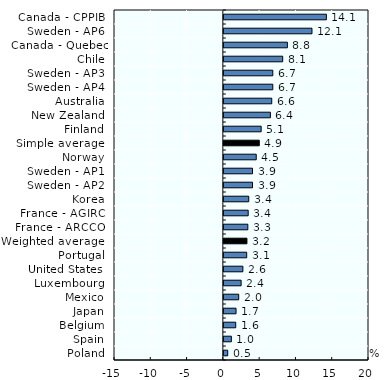
| Category | 2015 |
|---|---|
| Canada - CPPIB | 14.127 |
| Sweden - AP6 | 12.143 |
| Canada - Quebec Pension Plan | 8.753 |
| Chile | 8.107 |
| Sweden - AP3 | 6.746 |
| Sweden - AP4 | 6.746 |
| Australia | 6.6 |
| New Zealand | 6.411 |
| Finland | 5.141 |
| Simple average | 4.882 |
| Norway | 4.463 |
| Sweden - AP1 | 3.947 |
| Sweden - AP2 | 3.947 |
| Korea | 3.429 |
| France - AGIRC | 3.354 |
| France - ARCCO | 3.304 |
| Weighted average | 3.182 |
| Portugal | 3.146 |
| United States | 2.621 |
| Luxembourg | 2.381 |
| Mexico | 2.046 |
| Japan | 1.678 |
| Belgium | 1.635 |
| Spain | 1.033 |
| Poland | 0.534 |